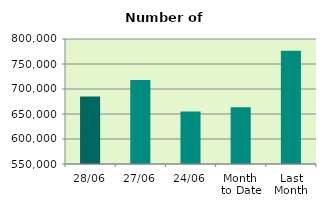
| Category | Series 0 |
|---|---|
| 28/06 | 685024 |
| 27/06 | 717828 |
| 24/06 | 654772 |
| Month 
to Date | 663399.6 |
| Last
Month | 776305.545 |